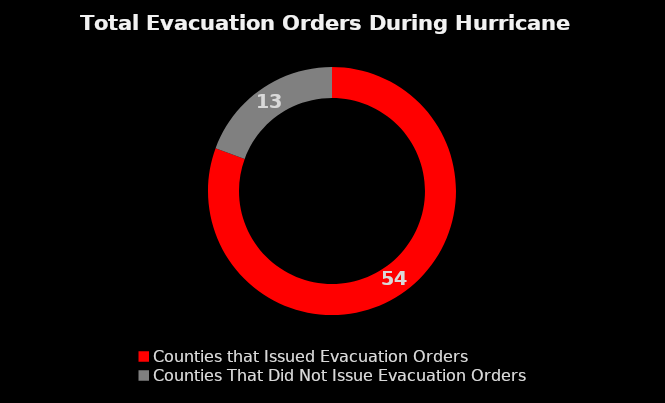
| Category | Series 0 |
|---|---|
| Counties that Issued Evacuation Orders | 54 |
| Counties That Did Not Issue Evacuation Orders | 13 |